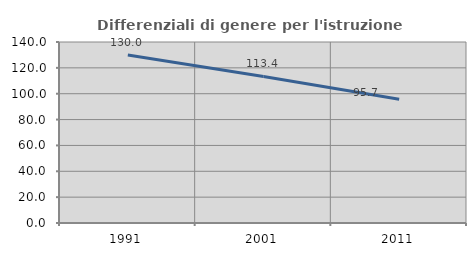
| Category | Differenziali di genere per l'istruzione superiore |
|---|---|
| 1991.0 | 130.019 |
| 2001.0 | 113.38 |
| 2011.0 | 95.698 |